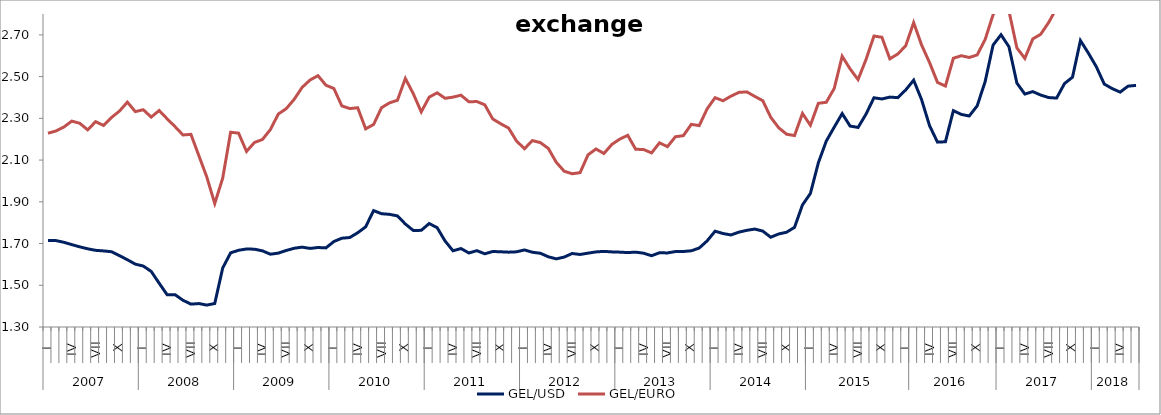
| Category | GEL/USD | GEL/EURO |
|---|---|---|
| 0 | 1.714 | 2.229 |
| 1 | 1.714 | 2.239 |
| 2 | 1.706 | 2.258 |
| 3 | 1.695 | 2.287 |
| 4 | 1.684 | 2.276 |
| 5 | 1.675 | 2.245 |
| 6 | 1.667 | 2.284 |
| 7 | 1.665 | 2.266 |
| 8 | 1.661 | 2.304 |
| 9 | 1.642 | 2.335 |
| 10 | 1.622 | 2.378 |
| 11 | 1.601 | 2.332 |
| 12 | 1.592 | 2.341 |
| 13 | 1.566 | 2.306 |
| 14 | 1.51 | 2.338 |
| 15 | 1.455 | 2.298 |
| 16 | 1.455 | 2.26 |
| 17 | 1.428 | 2.22 |
| 18 | 1.41 | 2.223 |
| 19 | 1.412 | 2.121 |
| 20 | 1.405 | 2.019 |
| 21 | 1.413 | 1.892 |
| 22 | 1.583 | 2.013 |
| 23 | 1.655 | 2.233 |
| 24 | 1.668 | 2.229 |
| 25 | 1.674 | 2.141 |
| 26 | 1.673 | 2.184 |
| 27 | 1.665 | 2.198 |
| 28 | 1.649 | 2.246 |
| 29 | 1.654 | 2.321 |
| 30 | 1.667 | 2.346 |
| 31 | 1.677 | 2.391 |
| 32 | 1.683 | 2.448 |
| 33 | 1.677 | 2.484 |
| 34 | 1.681 | 2.504 |
| 35 | 1.679 | 2.459 |
| 36 | 1.71 | 2.443 |
| 37 | 1.726 | 2.36 |
| 38 | 1.729 | 2.347 |
| 39 | 1.752 | 2.351 |
| 40 | 1.78 | 2.25 |
| 41 | 1.858 | 2.271 |
| 42 | 1.843 | 2.351 |
| 43 | 1.84 | 2.374 |
| 44 | 1.832 | 2.386 |
| 45 | 1.794 | 2.491 |
| 46 | 1.762 | 2.418 |
| 47 | 1.763 | 2.331 |
| 48 | 1.796 | 2.402 |
| 49 | 1.776 | 2.422 |
| 50 | 1.712 | 2.396 |
| 51 | 1.665 | 2.402 |
| 52 | 1.676 | 2.411 |
| 53 | 1.655 | 2.379 |
| 54 | 1.666 | 2.381 |
| 55 | 1.651 | 2.365 |
| 56 | 1.662 | 2.297 |
| 57 | 1.66 | 2.274 |
| 58 | 1.659 | 2.253 |
| 59 | 1.66 | 2.191 |
| 60 | 1.669 | 2.155 |
| 61 | 1.658 | 2.193 |
| 62 | 1.653 | 2.184 |
| 63 | 1.637 | 2.156 |
| 64 | 1.627 | 2.089 |
| 65 | 1.635 | 2.047 |
| 66 | 1.652 | 2.034 |
| 67 | 1.648 | 2.04 |
| 68 | 1.654 | 2.125 |
| 69 | 1.66 | 2.153 |
| 70 | 1.662 | 2.132 |
| 71 | 1.66 | 2.175 |
| 72 | 1.659 | 2.201 |
| 73 | 1.657 | 2.219 |
| 74 | 1.659 | 2.152 |
| 75 | 1.654 | 2.151 |
| 76 | 1.642 | 2.134 |
| 77 | 1.656 | 2.183 |
| 78 | 1.655 | 2.164 |
| 79 | 1.662 | 2.212 |
| 80 | 1.662 | 2.217 |
| 81 | 1.665 | 2.271 |
| 82 | 1.678 | 2.265 |
| 83 | 1.713 | 2.346 |
| 84 | 1.759 | 2.399 |
| 85 | 1.748 | 2.384 |
| 86 | 1.741 | 2.406 |
| 87 | 1.755 | 2.424 |
| 88 | 1.763 | 2.427 |
| 89 | 1.769 | 2.405 |
| 90 | 1.76 | 2.385 |
| 91 | 1.73 | 2.306 |
| 92 | 1.746 | 2.255 |
| 93 | 1.754 | 2.224 |
| 94 | 1.778 | 2.217 |
| 95 | 1.885 | 2.323 |
| 96 | 1.94 | 2.267 |
| 97 | 2.087 | 2.372 |
| 98 | 2.191 | 2.377 |
| 99 | 2.258 | 2.443 |
| 100 | 2.323 | 2.597 |
| 101 | 2.263 | 2.537 |
| 102 | 2.256 | 2.486 |
| 103 | 2.32 | 2.582 |
| 104 | 2.398 | 2.694 |
| 105 | 2.393 | 2.689 |
| 106 | 2.402 | 2.585 |
| 107 | 2.399 | 2.608 |
| 108 | 2.436 | 2.648 |
| 109 | 2.483 | 2.759 |
| 110 | 2.389 | 2.651 |
| 111 | 2.265 | 2.567 |
| 112 | 2.186 | 2.472 |
| 113 | 2.188 | 2.455 |
| 114 | 2.337 | 2.588 |
| 115 | 2.319 | 2.6 |
| 116 | 2.311 | 2.592 |
| 117 | 2.36 | 2.604 |
| 118 | 2.476 | 2.678 |
| 119 | 2.651 | 2.796 |
| 120 | 2.701 | 2.868 |
| 121 | 2.643 | 2.814 |
| 122 | 2.469 | 2.637 |
| 123 | 2.416 | 2.587 |
| 124 | 2.428 | 2.681 |
| 125 | 2.412 | 2.703 |
| 126 | 2.4 | 2.759 |
| 127 | 2.397 | 2.828 |
| 128 | 2.467 | 2.944 |
| 129 | 2.497 | 2.937 |
| 130 | 2.673 | 3.135 |
| 131 | 2.613 | 3.093 |
| 132 | 2.547 | 3.101 |
| 133 | 2.464 | 3.049 |
| 134 | 2.442 | 3.011 |
| 135 | 2.426 | 2.979 |
| 136 | 2.454 | 2.907 |
| 137 | 2.458 | 2.87 |